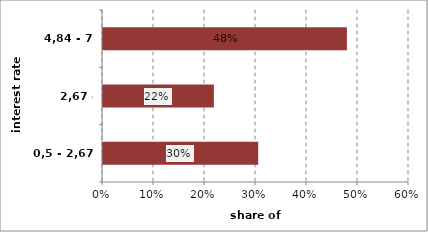
| Category | Series 0 |
|---|---|
| 0,5 - 2,67 | 0.304 |
| 2,67 - 4,84 | 0.217 |
| 4,84 - 7 | 0.478 |